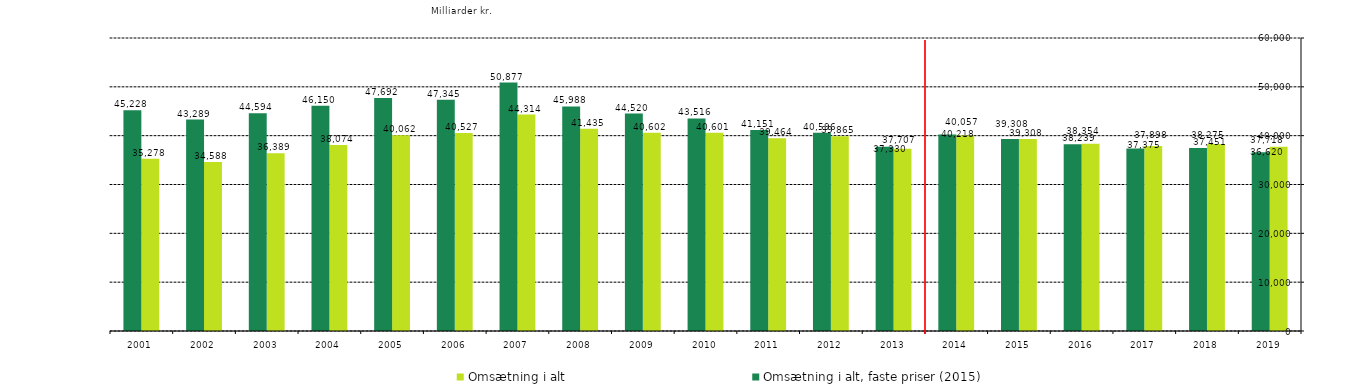
| Category | Omsætning i alt | Omsætning i alt, faste priser (2015) |
|---|---|---|
| 2019.0 | 37718.14 | 36619.553 |
| 2018.0 | 38275.183 | 37451.255 |
| 2017.0 | 37897.985 | 37374.739 |
| 2016.0 | 38353.811 | 38239.094 |
| 2015.0 | 39307.582 | 39307.582 |
| 2014.0 | 40056.669 | 40217.539 |
| 2013.0 | 37330.068 | 37707.139 |
| 2012.0 | 39864.928 | 40595.65 |
| 2011.0 | 39464.007 | 41151.206 |
| 2010.0 | 40600.517 | 43516.095 |
| 2009.0 | 40601.91 | 44519.638 |
| 2008.0 | 41434.892 | 45987.672 |
| 2007.0 | 44313.991 | 50877.142 |
| 2006.0 | 40527.202 | 47344.862 |
| 2005.0 | 40061.522 | 47692.288 |
| 2004.0 | 38073.875 | 46150.151 |
| 2003.0 | 36389.021 | 44594.388 |
| 2002.0 | 34587.914 | 43289.004 |
| 2001.0 | 35277.741 | 45227.873 |